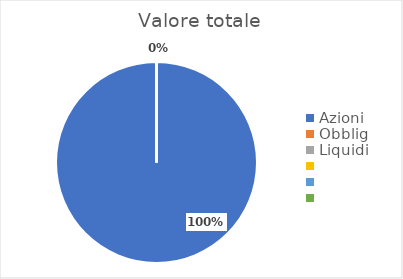
| Category | Valore totale |
|---|---|
| Azioni | 3827.55 |
| Obblig | 0 |
| Liquidi | 0 |